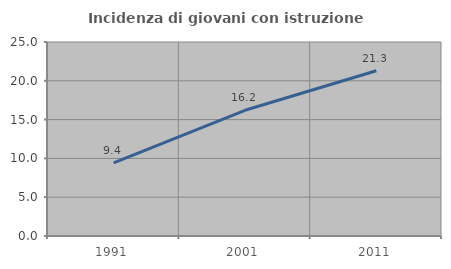
| Category | Incidenza di giovani con istruzione universitaria |
|---|---|
| 1991.0 | 9.428 |
| 2001.0 | 16.197 |
| 2011.0 | 21.296 |